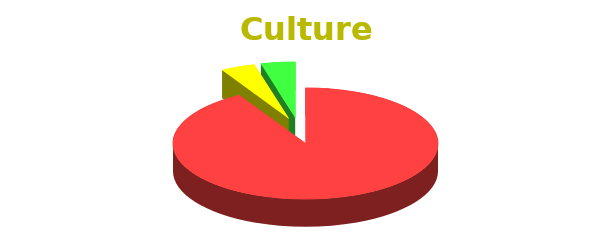
| Category | Culture |
|---|---|
| Unconsciously Incompetent | 22 |
| Consciously Incompetent | 1 |
| Consciously Competent | 1 |